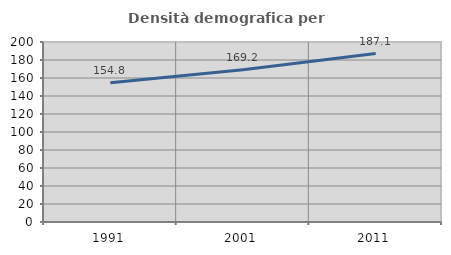
| Category | Densità demografica |
|---|---|
| 1991.0 | 154.797 |
| 2001.0 | 169.178 |
| 2011.0 | 187.142 |